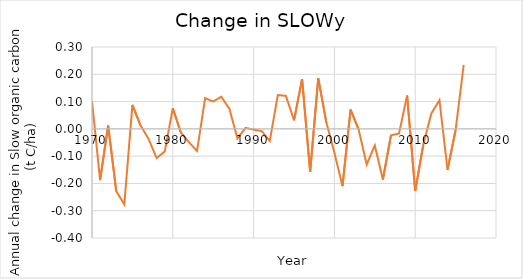
| Category | Series 0 |
|---|---|
| 1970.0 | 0.102 |
| 1971.0 | -0.188 |
| 1972.0 | 0.012 |
| 1973.0 | -0.228 |
| 1974.0 | -0.277 |
| 1975.0 | 0.088 |
| 1976.0 | 0.013 |
| 1977.0 | -0.037 |
| 1978.0 | -0.107 |
| 1979.0 | -0.083 |
| 1980.0 | 0.075 |
| 1981.0 | -0.014 |
| 1982.0 | -0.049 |
| 1983.0 | -0.081 |
| 1984.0 | 0.112 |
| 1985.0 | 0.1 |
| 1986.0 | 0.118 |
| 1987.0 | 0.074 |
| 1988.0 | -0.035 |
| 1989.0 | 0.004 |
| 1990.0 | -0.003 |
| 1991.0 | -0.008 |
| 1992.0 | -0.044 |
| 1993.0 | 0.124 |
| 1994.0 | 0.121 |
| 1995.0 | 0.031 |
| 1996.0 | 0.182 |
| 1997.0 | -0.158 |
| 1998.0 | 0.186 |
| 1999.0 | 0.024 |
| 2000.0 | -0.088 |
| 2001.0 | -0.21 |
| 2002.0 | 0.071 |
| 2003.0 | -0.003 |
| 2004.0 | -0.131 |
| 2005.0 | -0.061 |
| 2006.0 | -0.186 |
| 2007.0 | -0.024 |
| 2008.0 | -0.017 |
| 2009.0 | 0.122 |
| 2010.0 | -0.228 |
| 2011.0 | -0.058 |
| 2012.0 | 0.057 |
| 2013.0 | 0.105 |
| 2014.0 | -0.15 |
| 2015.0 | -0.004 |
| 2016.0 | 0.235 |